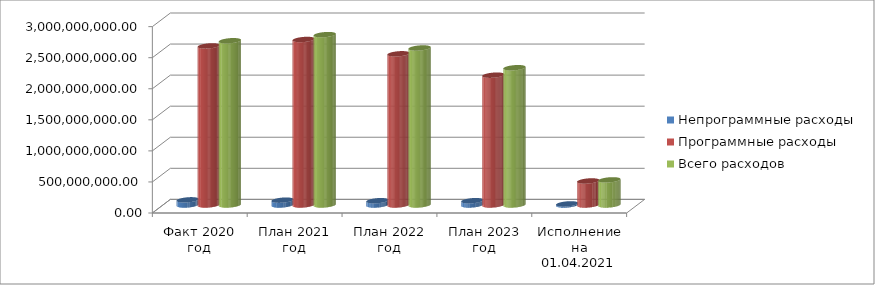
| Category | Непрограммные расходы | Программные расходы | Всего расходов |
|---|---|---|---|
| Факт 2020 год | 83148306 | 2561058133.41 | 2644206439.41 |
| План 2021 год | 77960142.14 | 2664481106.73 | 2742441248.87 |
| План 2022 год | 69285920 | 2434181207.6 | 2527827127.6 |
| План 2023 год | 69331020 | 2089976785.64 | 2209927805.64 |
| Исполнение на 01.04.2021 года | 17522280.82 | 387047065.49 | 404569346.31 |